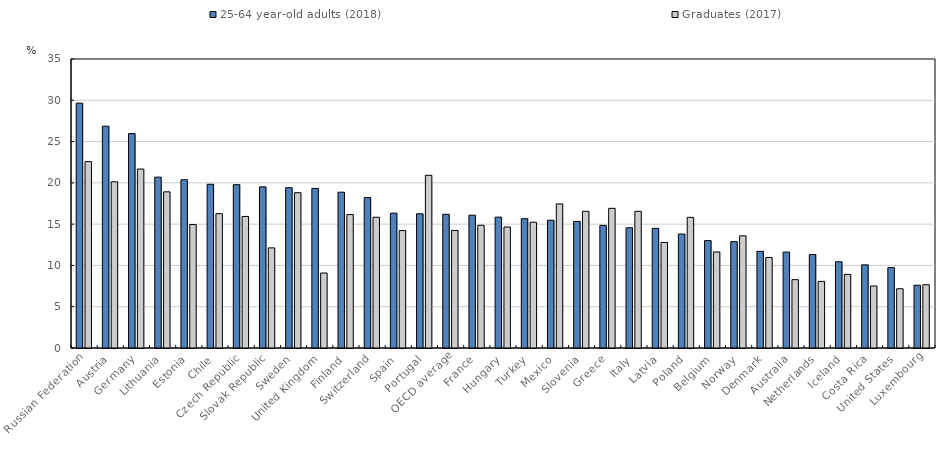
| Category | 25-64 year-old adults (2018) | Graduates (2017) |
|---|---|---|
| Russian Federation | 29.653 | 22.572 |
| Austria | 26.861 | 20.128 |
| Germany | 25.966 | 21.672 |
| Lithuania | 20.69 | 18.913 |
| Estonia | 20.379 | 14.952 |
| Chile | 19.828 | 16.267 |
| Czech Republic | 19.779 | 15.935 |
| Slovak Republic | 19.514 | 12.127 |
| Sweden | 19.413 | 18.807 |
| United Kingdom | 19.328 | 9.083 |
| Finland | 18.869 | 16.163 |
| Switzerland | 18.213 | 15.838 |
| Spain | 16.327 | 14.225 |
| Portugal | 16.253 | 20.914 |
| OECD average | 16.195 | 14.231 |
| France | 16.085 | 14.861 |
| Hungary | 15.849 | 14.658 |
| Turkey | 15.657 | 15.233 |
| Mexico | 15.476 | 17.452 |
| Slovenia | 15.327 | 16.557 |
| Greece | 14.85 | 16.915 |
| Italy | 14.562 | 16.553 |
| Latvia | 14.491 | 12.785 |
| Poland | 13.802 | 15.825 |
| Belgium | 13.008 | 11.63 |
| Norway | 12.884 | 13.584 |
| Denmark | 11.706 | 10.965 |
| Australia | 11.618 | 8.278 |
| Netherlands | 11.317 | 8.068 |
| Iceland | 10.442 | 8.921 |
| Costa Rica | 10.071 | 7.505 |
| United States | 9.743 | 7.174 |
| Luxembourg | 7.605 | 7.666 |